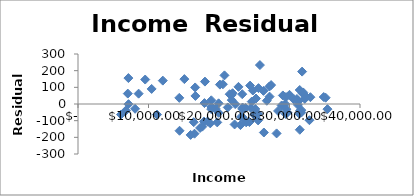
| Category | Series 0 |
|---|---|
| 30000.0 | 55.105 |
| 31790.0 | 194.395 |
| 31460.0 | -154.579 |
| 31507.0 | -39.675 |
| 31452.0 | 83.977 |
| 29494.0 | 41.561 |
| 25548.0 | -98.526 |
| 23341.0 | -21.192 |
| 24989.0 | -65.416 |
| 21247.0 | -20.591 |
| 21926.0 | 64.778 |
| 23288.0 | -29.43 |
| 27174.0 | 44.289 |
| 29701.0 | -50.67 |
| 25805.0 | 233.565 |
| 24414.0 | 110.369 |
| 23855.0 | -109.848 |
| 25603.0 | 95.19 |
| 22210.0 | -122.677 |
| 25146.0 | -29.747 |
| 26364.0 | -171.073 |
| 23341.0 | -79.726 |
| 19751.0 | -110.271 |
| 21796.0 | 54.315 |
| 24646.0 | 14.426 |
| 21806.0 | 23.229 |
| 24804.0 | 80.87 |
| 25520.0 | -59.048 |
| 23042.0 | -126.587 |
| 20554.0 | 118.469 |
| 23297.0 | 58.811 |
| 27145.0 | 104.686 |
| 27390.0 | 113.575 |
| 28170.0 | -176.455 |
| 26304.0 | 78.644 |
| 24313.0 | -108.453 |
| 23131.0 | -77.578 |
| 26784.0 | 19.421 |
| 30597.0 | 28.225 |
| 32363.0 | 43.808 |
| 35128.0 | 37.723 |
| 31683.0 | -37.036 |
| 28379.0 | -41.627 |
| 31393.0 | -58.211 |
| 34854.0 | 41.957 |
| 31950.0 | 69.218 |
| 35382.0 | -30.872 |
| 32964.0 | 40.828 |
| 31677.0 | -51.315 |
| 29060.0 | 51.317 |
| 29477.0 | -60.248 |
| 32829.0 | -97.284 |
| 31883.0 | 62.776 |
| 29389.0 | 0.099 |
| 31054.0 | 30.112 |
| 31194.0 | -5.355 |
| 32166.0 | 30.671 |
| 29553.0 | -31 |
| 31286.0 | 17.972 |
| 28885.0 | -8.813 |
| 25242.0 | 32.876 |
| 24529.0 | -24.026 |
| 21517.0 | 58.675 |
| 18897.0 | -30.706 |
| 22299.0 | -0.69 |
| 19496.0 | -27.746 |
| 19944.0 | 3.983 |
| 23761.0 | -24.245 |
| 19948.0 | -52.932 |
| 17317.0 | -143.573 |
| 18764.0 | -116.131 |
| 20132.0 | 116.337 |
| 18382.0 | -104.78 |
| 16620.0 | 99.324 |
| 18007.0 | 134.425 |
| 15088.0 | 149.334 |
| 16415.0 | -109.06 |
| 14402.0 | -160.566 |
| 11210.0 | -63.546 |
| 9534.0 | 146.773 |
| 8098.0 | -28.706 |
| 6100.0 | -63.325 |
| 7149.0 | 155.554 |
| 7169.0 | -1.04 |
| 8601.0 | 62.12 |
| 7064.0 | 62.462 |
| 6784.0 | -39.324 |
| 10447.0 | 90.447 |
| 12032.0 | 140.318 |
| 14367.0 | 36.84 |
| 17637.0 | -135.789 |
| 15973.0 | -185.418 |
| 18908.0 | 22.14 |
| 18896.0 | -16.307 |
| 22763.0 | 102.799 |
| 20775.0 | 171.75 |
| 17938.0 | 5.54 |
| 16655.0 | 48.332 |
| 16525.0 | -178.292 |
| 17871.0 | -104.901 |